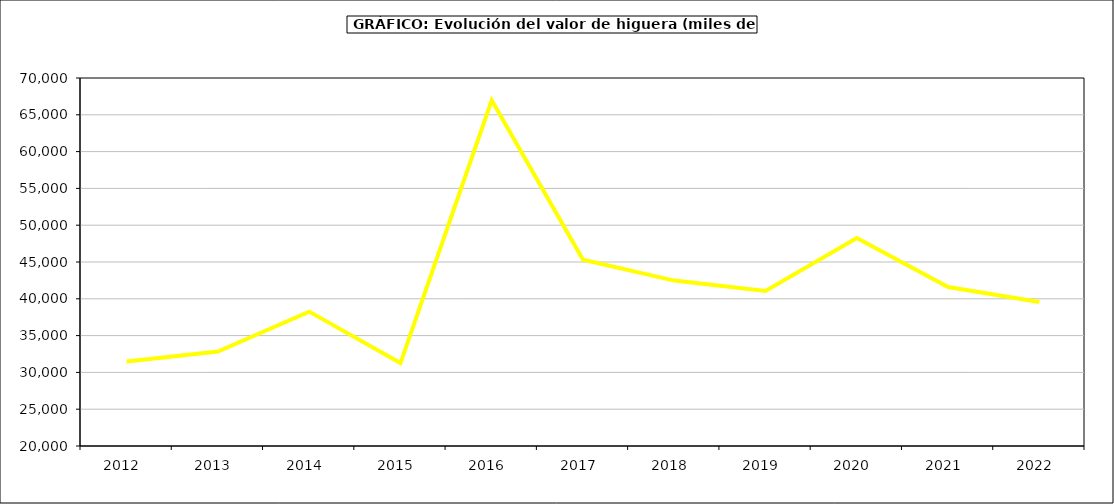
| Category | valor higuera |
|---|---|
| 2012.0 | 31478.992 |
| 2013.0 | 32844.373 |
| 2014.0 | 38257.221 |
| 2015.0 | 31266 |
| 2016.0 | 66968 |
| 2017.0 | 45296.738 |
| 2018.0 | 42473.625 |
| 2019.0 | 41072.008 |
| 2020.0 | 48249.45 |
| 2021.0 | 41603.947 |
| 2022.0 | 39573.3 |